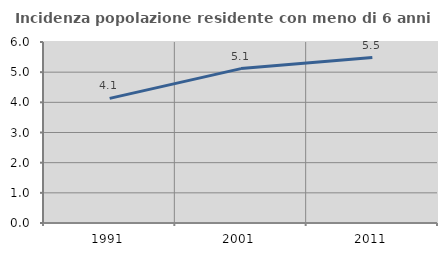
| Category | Incidenza popolazione residente con meno di 6 anni |
|---|---|
| 1991.0 | 4.131 |
| 2001.0 | 5.119 |
| 2011.0 | 5.485 |